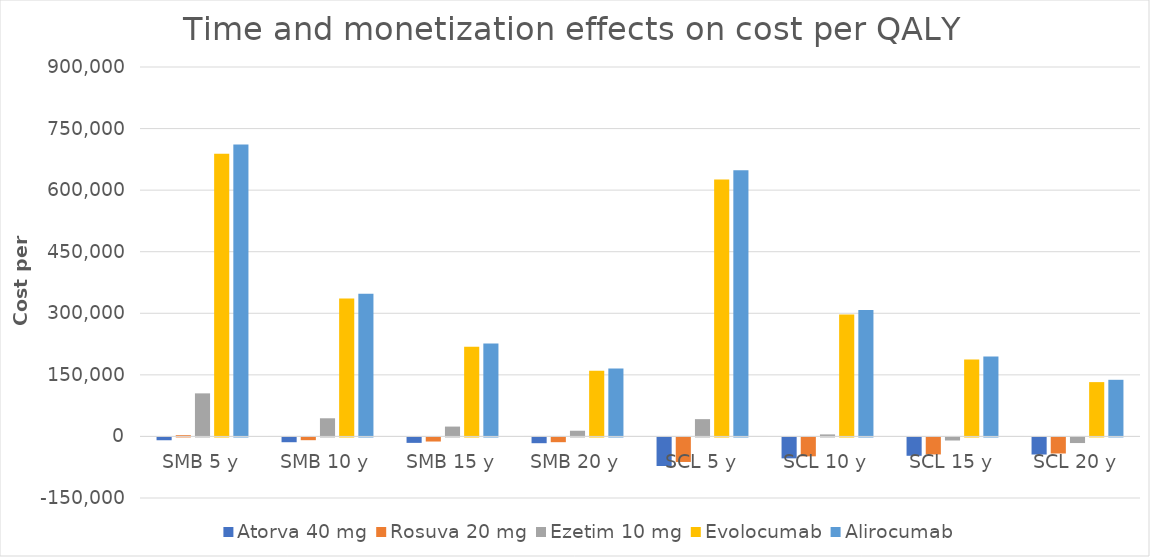
| Category | Atorva 40 mg | Rosuva 20 mg | Ezetim 10 mg | Evolocumab | Alirocumab |
|---|---|---|---|---|---|
| SMB 5 y | -6866.116 | 3014.47 | 104902.811 | 688854.814 | 711456.343 |
| SMB 10 y | -11668.352 | -6728.059 | 44216.111 | 336192.113 | 347492.877 |
| SMB 15 y | -13269.097 | -9975.569 | 23987.211 | 218637.879 | 226171.722 |
| SMB 20 y | -14069.47 | -11599.324 | 13872.762 | 159860.762 | 165511.145 |
| SCL 5 y | -69647.292 | -59766.706 | 42121.634 | 626073.637 | 648675.167 |
| SCL 10 y | -50964.823 | -46024.53 | 4919.641 | 296895.642 | 308196.407 |
| SCL 15 y | -44737.333 | -41443.804 | -7481.024 | 187169.644 | 194703.487 |
| SCL 20 y | -41623.588 | -39153.441 | -13681.356 | 132306.645 | 137957.027 |